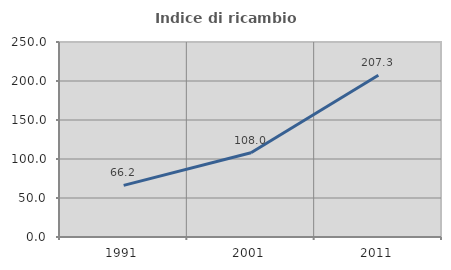
| Category | Indice di ricambio occupazionale  |
|---|---|
| 1991.0 | 66.154 |
| 2001.0 | 108.036 |
| 2011.0 | 207.273 |